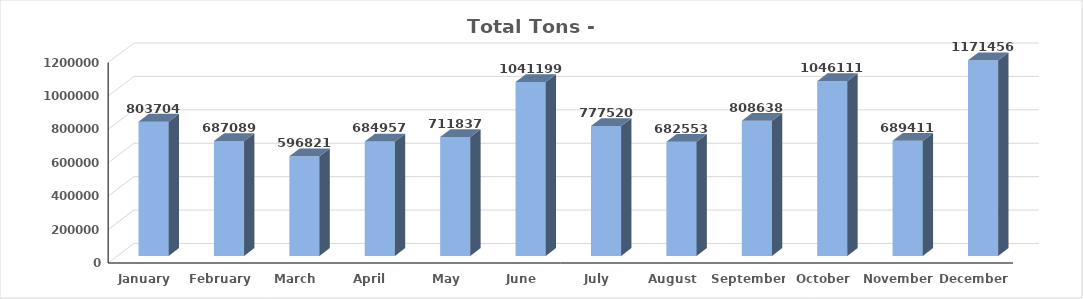
| Category | Series 0 |
|---|---|
| January | 803704 |
| February | 687089 |
| March | 596821 |
| April | 684957 |
| May | 711837 |
| June | 1041199 |
| July | 777520 |
| August | 682553 |
| September | 808638 |
| October | 1046111 |
| November | 689411 |
| December | 1171456 |